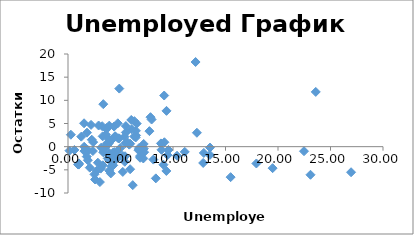
| Category | Series 0 |
|---|---|
| 1.54200005531311 | -0.022 |
| 7.25299978256226 | -1.191 |
| 9.48299980163574 | -1.823 |
| 5.38700008392334 | 2.155 |
| 4.78599977493286 | 1.807 |
| 5.21999979019165 | -5.448 |
| 0.962000012397766 | -3.849 |
| 4.30800008773804 | -1.263 |
| 6.32299995422363 | 5.508 |
| 9.36800003051758 | -5.243 |
| 2.19700002670288 | 4.705 |
| 3.25799989700317 | 4.411 |
| 17.9409999847412 | -3.629 |
| 5.26100015640259 | -2.474 |
| 6.05900001525879 | 3.744 |
| 1.52799999713898 | 5.046 |
| 12.2760000228882 | 3.002 |
| 1.04799997806549 | -3.615 |
| 3.36100006103516 | 9.174 |
| 5.92000007629395 | 0.639 |
| 6.48299980163574 | 2.421 |
| 7.22300004959106 | -0.427 |
| 4.41699981689453 | -1.187 |
| 9.0930004119873 | -3.898 |
| 3.71000003814697 | 0.717 |
| 4.15500020980835 | 1.456 |
| 10.3819999694824 | -1.96 |
| 8.12800025939941 | -2.787 |
| 8.85000038146973 | 0.703 |
| 2.26399993896484 | 1.499 |
| 2.3970000743866 | 0.979 |
| 4.97499990463257 | -0.299 |
| 11.1219997406006 | -1.125 |
| 5.8289999961853 | 0.437 |
| 3.91000008583069 | -1.331 |
| 4.3899998664856 | 4.336 |
| 9.16199970245361 | 11.037 |
| 6.54300022125244 | 4.977 |
| 5.50799989700317 | 4.446 |
| 22.4769992828369 | -0.981 |
| 1.80900001525879 | 3.021 |
| 4.15199995040894 | -4.206 |
| 7.75500011444092 | 3.353 |
| 9.18000030517578 | 0.952 |
| 19.488000869751 | -4.638 |
| 8.90499973297119 | -0.679 |
| 3.42499995231628 | -0.393 |
| 6.71000003814697 | -0.754 |
| 2.72699999809265 | -5.21 |
| 3.60700011253357 | 2.611 |
| 4.05700016021729 | -2.219 |
| 12.1510000228882 | 18.273 |
| 13.5260000228882 | -0.189 |
| 4.07600021362305 | -5.776 |
| 3.66300010681152 | 4.007 |
| 2.91799998283386 | 4.567 |
| 4.30000019073486 | -4.034 |
| 5.69099998474121 | 0.878 |
| 3.95000004768372 | -2.969 |
| 4.88500022888184 | 12.536 |
| 3.30299997329712 | 2.232 |
| 2.07599997520447 | -4.525 |
| 7.17000007629395 | -2.549 |
| 0.609000027179718 | -0.713 |
| 7.85699987411499 | 6.365 |
| 6.16699981689453 | -8.305 |
| 23.5960006713867 | 11.817 |
| 5.46999979019165 | 0.726 |
| 1.65900003910065 | -0.927 |
| 5.42999982833862 | -2.071 |
| 3.35999989509583 | -1.214 |
| 9.56900024414063 | -0.719 |
| 4.58300018310547 | -2.72 |
| 6.86700010299683 | -2.394 |
| 3.32200002670288 | -4.024 |
| 6.32000017166138 | 2.213 |
| 3.17199993133545 | -0.198 |
| 1.56400001049042 | -0.953 |
| 23.0949993133545 | -6.063 |
| 1.26400005817413 | 2.157 |
| 3.88000011444092 | 0.705 |
| 4.52199983596802 | 2.174 |
| 4.47900009155273 | 2.247 |
| 0.273000001907349 | 2.579 |
| 6.02600002288818 | 5.761 |
| 3.91899991035461 | 1.582 |
| 3.11299991607666 | -4.738 |
| 3.03800010681152 | -7.639 |
| 3.92199993133545 | -5.179 |
| 2.36700010299683 | -0.945 |
| 4.71199989318848 | -1.048 |
| 2.84400010108948 | -3.462 |
| 2.51500010490417 | -5.975 |
| 3.67300009727478 | 3.804 |
| 6.8600001335144 | -2.033 |
| 0.142000004649162 | -0.867 |
| 4.29500007629395 | -2.032 |
| 4.74399995803833 | 5.043 |
| 5.91900014877319 | -4.867 |
| 6.46400022506714 | 3.418 |
| 13.5100002288818 | -1.783 |
| 3.76799988746643 | 0.396 |
| 6.75600004196167 | -0.323 |
| 5.51000022888184 | 3.077 |
| 1.78999996185303 | -2.145 |
| 26.9580001831055 | -5.52 |
| 15.4870004653931 | -6.579 |
| 12.8760004043579 | -3.52 |
| 6.44399976730347 | 1.98 |
| 4.88299989700317 | 1.783 |
| 1.932000041008 | -0.785 |
| 1.02699995040894 | -3.866 |
| 3.78299999237061 | -2.533 |
| 9.38099956512451 | 7.727 |
| 2.57500004768372 | -7.082 |
| 3.9539999961853 | -1.854 |
| 3.93300008773804 | 4.536 |
| 7.96099996566772 | 5.858 |
| 5.22300004959106 | -2.007 |
| 5.40899991989136 | -3.256 |
| 8.36499977111816 | -6.84 |
| 1.89100003242493 | -2.926 |
| 12.9340000152588 | -1.356 |
| 7.20900011062622 | 0.58 |